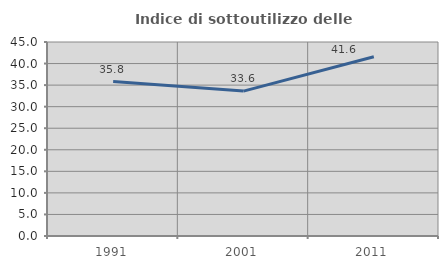
| Category | Indice di sottoutilizzo delle abitazioni  |
|---|---|
| 1991.0 | 35.816 |
| 2001.0 | 33.608 |
| 2011.0 | 41.583 |